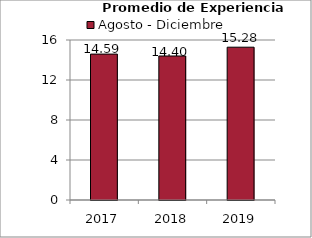
| Category | Agosto - Diciembre |
|---|---|
| 2017.0 | 14.59 |
| 2018.0 | 14.4 |
| 2019.0 | 15.28 |